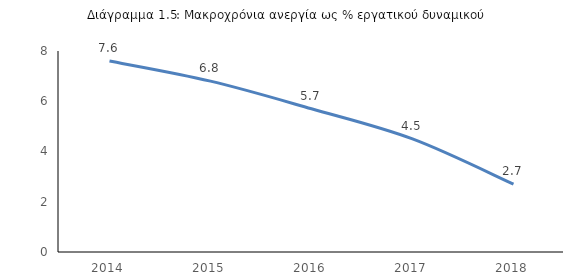
| Category |  >12 μήνες/εργατικό δυναμικό % |
|---|---|
| 2014.0 | 7.6 |
| 2015.0 | 6.8 |
| 2016.0 | 5.7 |
| 2017.0 | 4.5 |
| 2018.0 | 2.7 |